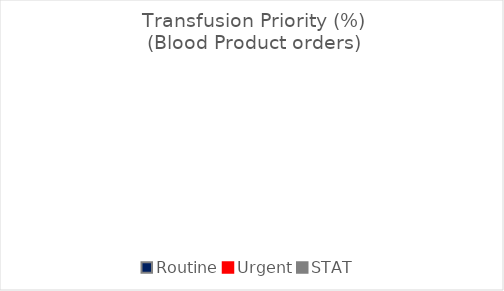
| Category | Series 0 |
|---|---|
| Routine | 0 |
| Urgent | 0 |
| STAT | 0 |